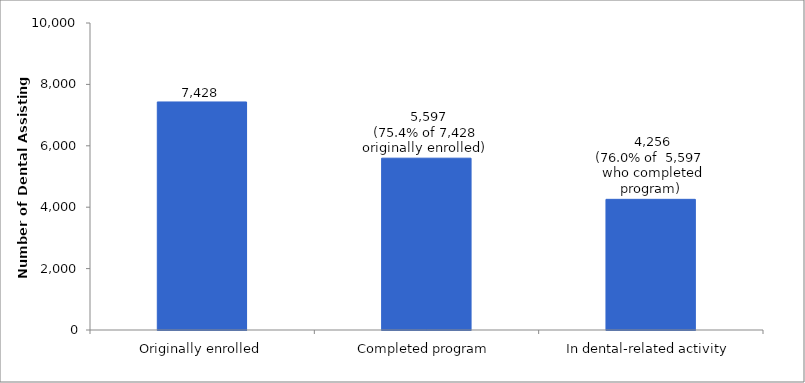
| Category | Series 0 |
|---|---|
| Originally enrolled | 7428 |
| Completed program | 5597 |
| In dental-related activity | 4256 |